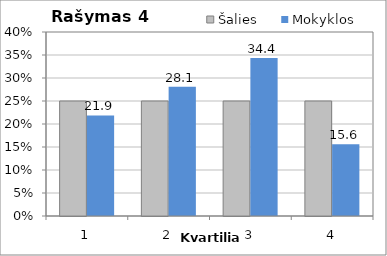
| Category | Šalies | Mokyklos |
|---|---|---|
| 1.0 | 25 | 21.875 |
| 2.0 | 25 | 28.125 |
| 3.0 | 25 | 34.375 |
| 4.0 | 25 | 15.625 |